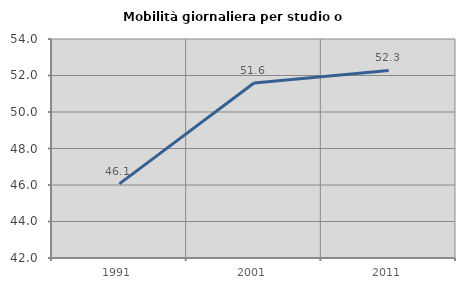
| Category | Mobilità giornaliera per studio o lavoro |
|---|---|
| 1991.0 | 46.063 |
| 2001.0 | 51.592 |
| 2011.0 | 52.276 |